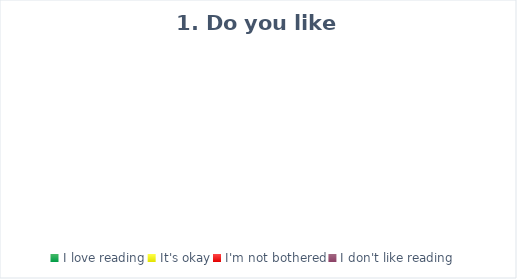
| Category | Series 0 |
|---|---|
| I love reading | 0 |
| It's okay | 0 |
| I'm not bothered | 0 |
| I don't like reading | 0 |